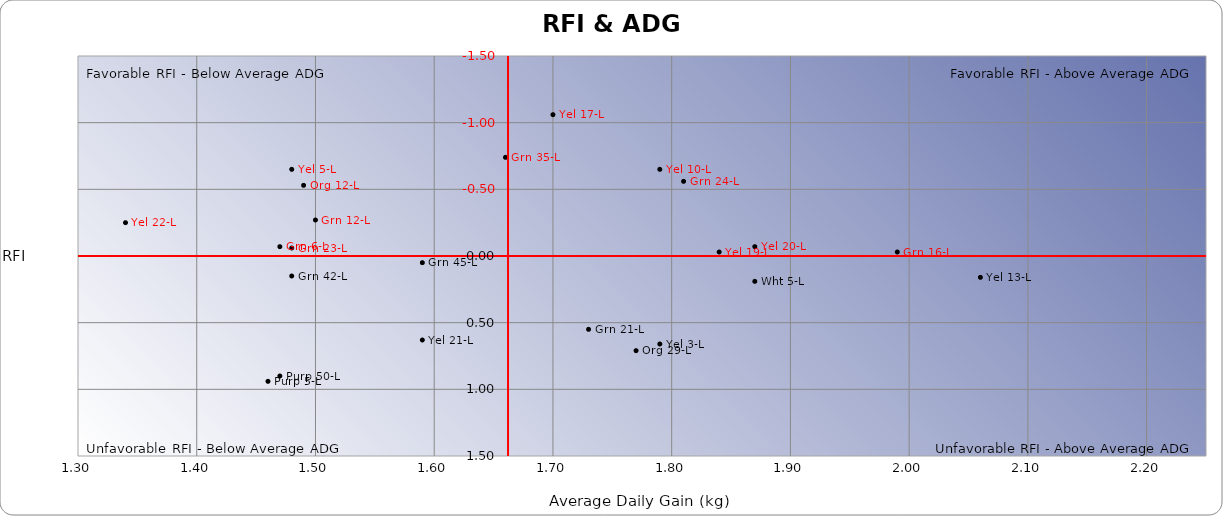
| Category | Series 0 |
|---|---|
| 1.7 | -1.06 |
| 1.66 | -0.74 |
| 1.79 | -0.65 |
| 1.48 | -0.65 |
| 1.81 | -0.56 |
| 1.49 | -0.53 |
| 1.5 | -0.27 |
| 1.34 | -0.25 |
| 1.47 | -0.07 |
| 1.87 | -0.07 |
| 1.48 | -0.06 |
| 1.84 | -0.03 |
| 1.99 | -0.03 |
| 1.59 | 0.05 |
| 1.48 | 0.15 |
| 2.06 | 0.16 |
| 1.87 | 0.19 |
| 1.73 | 0.55 |
| 1.59 | 0.63 |
| 1.79 | 0.66 |
| 1.77 | 0.71 |
| 1.47 | 0.9 |
| 1.46 | 0.94 |